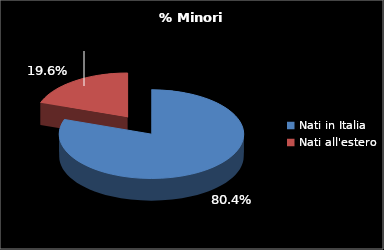
| Category | Series 0 |
|---|---|
| Nati in Italia | 45 |
| Nati all'estero | 11 |